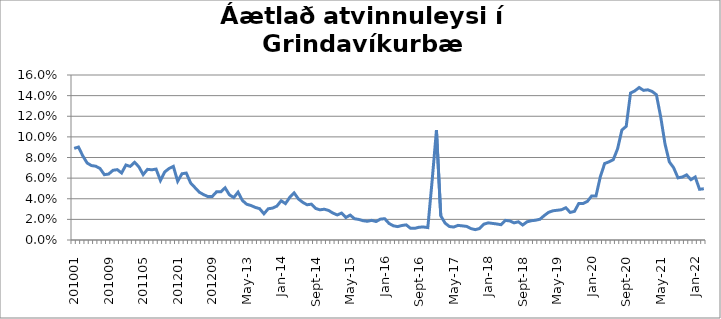
| Category | Series 0 |
|---|---|
| 201001 | 0.089 |
| 201002 | 0.09 |
| 201003 | 0.082 |
| 201004 | 0.075 |
| 201005 | 0.072 |
| 201006 | 0.072 |
| 201007 | 0.069 |
| 201008 | 0.063 |
| 201009 | 0.064 |
| 201010 | 0.068 |
| 201011 | 0.068 |
| 201012 | 0.065 |
| 201101 | 0.073 |
| 201102 | 0.071 |
| 201103 | 0.075 |
| 201104 | 0.071 |
| 201105 | 0.063 |
| 201106 | 0.069 |
| 201107 | 0.068 |
| 201108 | 0.069 |
| 201109 | 0.058 |
| 201110 | 0.066 |
| 201111 | 0.069 |
| 201112 | 0.071 |
| 201201 | 0.057 |
| 201202 | 0.064 |
| 201203 | 0.065 |
| 201204 | 0.055 |
| 201205 | 0.051 |
| 201206 | 0.046 |
| 201207 | 0.044 |
| 201208 | 0.042 |
| 201209 | 0.042 |
| 201210 | 0.047 |
| 201211 | 0.047 |
| 201212 | 0.051 |
| jan.13 | 0.044 |
| feb.13 | 0.041 |
| mar.13 | 0.046 |
| apr.13 | 0.038 |
| maí.13 | 0.035 |
| jún.13 | 0.033 |
| júl.13 | 0.032 |
| ágú.13 | 0.03 |
| sep.13 | 0.025 |
| okt.13 | 0.03 |
| nóv.13 | 0.031 |
| des.13 | 0.033 |
| jan.14 | 0.038 |
| feb.14 | 0.035 |
| mar.14 | 0.041 |
| apr.14 | 0.046 |
| maí.14 | 0.04 |
| jún.14 | 0.037 |
| júl.14 | 0.034 |
| ágú.14 | 0.035 |
| sep.14 | 0.031 |
| okt.14 | 0.029 |
| nóv.14 | 0.03 |
| des.14 | 0.029 |
| jan.15 | 0.026 |
| feb.15 | 0.024 |
| mar.15 | 0.026 |
| apr.15 | 0.022 |
| maí.15 | 0.024 |
| jún.15 | 0.021 |
| júl.15 | 0.02 |
| ágú.15 | 0.019 |
| sep.15 | 0.018 |
| okt.15 | 0.019 |
| nóv.15 | 0.018 |
| des.15 | 0.02 |
| jan.16 | 0.021 |
| feb.16 | 0.016 |
| mar.16 | 0.014 |
| apr.16 | 0.013 |
| maí.16 | 0.014 |
| jún.16 | 0.015 |
| júl.16 | 0.011 |
| ágú.16 | 0.011 |
| sep.16 | 0.012 |
| okt.16 | 0.013 |
| nóv.16 | 0.012 |
| des.16 | 0.058 |
| jan.17 | 0.106 |
| feb.17 | 0.023 |
| mar.17 | 0.016 |
| apr.17 | 0.013 |
| maí.17 | 0.013 |
| jún.17 | 0.014 |
| júl.17 | 0.014 |
| ágú.17 | 0.013 |
| sep.17 | 0.011 |
| okt.17 | 0.01 |
| nóv.17 | 0.011 |
| des.17 | 0.015 |
| jan.18 | 0.017 |
| feb.18 | 0.016 |
| mar.18 | 0.016 |
| apr.18 | 0.015 |
| maí.18 | 0.019 |
| jún.18 | 0.018 |
| júl.18 | 0.017 |
| ágú.18 | 0.018 |
| sep.18 | 0.015 |
| okt.18 | 0.018 |
| nóv.18 | 0.019 |
| des.18 | 0.019 |
| jan.19 | 0.02 |
| feb.19 | 0.024 |
| mar.19 | 0.027 |
| apr.19 | 0.028 |
| maí.19 | 0.029 |
| jún.19 | 0.029 |
| júl.19 | 0.031 |
| ágú.19 | 0.027 |
| sep.19 | 0.028 |
| okt.19 | 0.035 |
| nóv.19 | 0.035 |
| des.19 | 0.037 |
| jan.20 | 0.043 |
| feb.20 | 0.043 |
| mars 2020 *** | 0.061 |
| apr.20 | 0.074 |
| maí.20 | 0.076 |
| jún.20 | 0.078 |
| júl.20 | 0.088 |
| ágú.20 | 0.107 |
| sep.20 | 0.11 |
| okt.20 | 0.142 |
| nóv.20 | 0.145 |
| des.20 | 0.148 |
| jan.21 | 0.145 |
| feb.21 | 0.146 |
| mar.21 | 0.144 |
| apr.21 | 0.141 |
| maí.21 | 0.119 |
| jún.21 | 0.093 |
| júl.21 | 0.076 |
| ágú.21 | 0.07 |
| sep.21 | 0.06 |
| okt.21 | 0.061 |
| nóv.21 | 0.063 |
| des.21 | 0.058 |
| jan.22 | 0.061 |
| feb.22 | 0.049 |
| mar.22 | 0.05 |